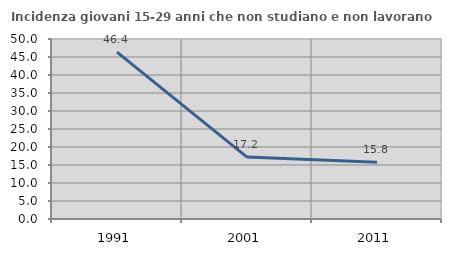
| Category | Incidenza giovani 15-29 anni che non studiano e non lavorano  |
|---|---|
| 1991.0 | 46.354 |
| 2001.0 | 17.192 |
| 2011.0 | 15.795 |